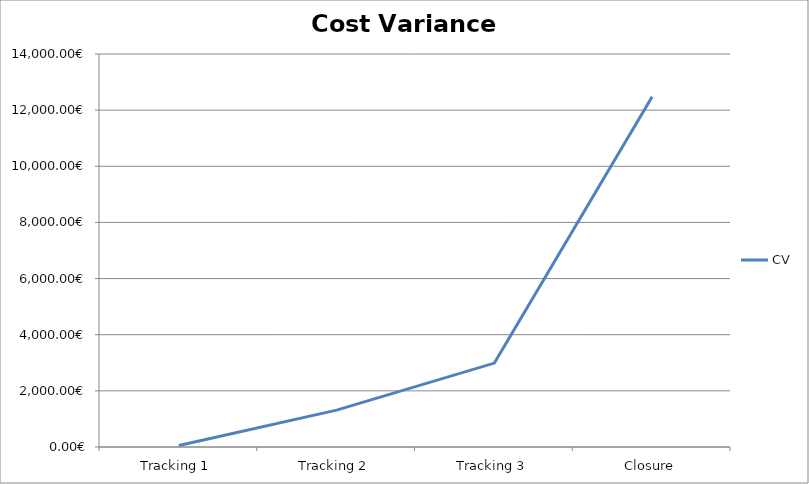
| Category | CV |
|---|---|
| Tracking 1 | 54 |
| Tracking 2 | 1314.45 |
| Tracking 3 | 2989.359 |
| Closure | 12480 |